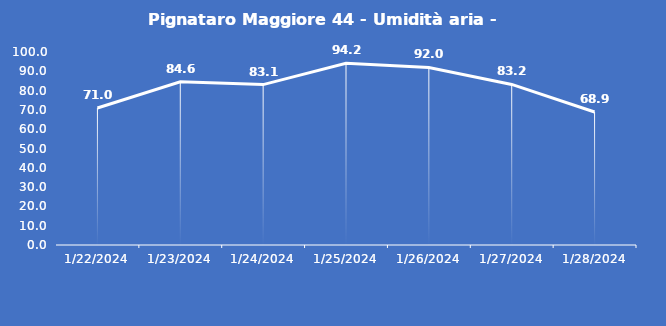
| Category | Pignataro Maggiore 44 - Umidità aria - Grezzo (%) |
|---|---|
| 1/22/24 | 71 |
| 1/23/24 | 84.6 |
| 1/24/24 | 83.1 |
| 1/25/24 | 94.2 |
| 1/26/24 | 92 |
| 1/27/24 | 83.2 |
| 1/28/24 | 68.9 |